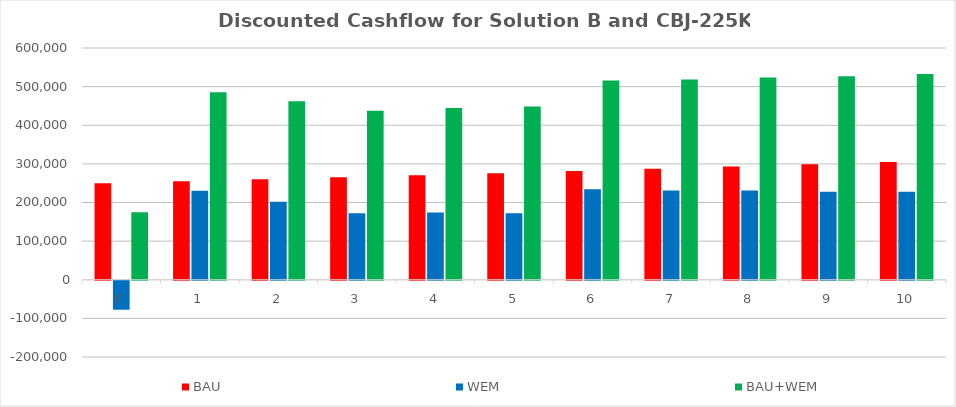
| Category | BAU | WEM | BAU+WEM |
|---|---|---|---|
| 0.0 | 250000 | -75000 | 175000 |
| 1.0 | 255000 | 230122 | 485122 |
| 2.0 | 260100 | 202058 | 462158 |
| 3.0 | 265302 | 172368 | 437670 |
| 4.0 | 270608 | 173945 | 444553 |
| 5.0 | 276020 | 172482 | 448502 |
| 6.0 | 281540 | 234000 | 515540 |
| 7.0 | 287171 | 231000 | 518171 |
| 8.0 | 292914 | 231000 | 523914 |
| 9.0 | 298772 | 228000 | 526772 |
| 10.0 | 304747 | 228000 | 532747 |